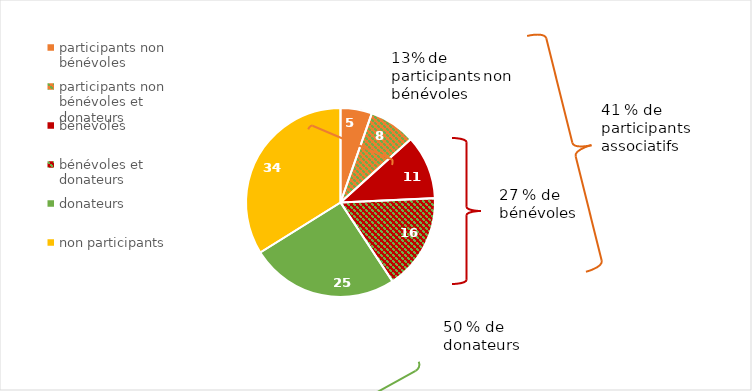
| Category | Series 0 |
|---|---|
| participants non bénévoles | 5.37 |
| participants non bénévoles et donateurs | 7.94 |
| bénévoles | 10.96 |
| bénévoles et donateurs | 16.45 |
| donateurs | 25.41 |
| non participants | 33.87 |